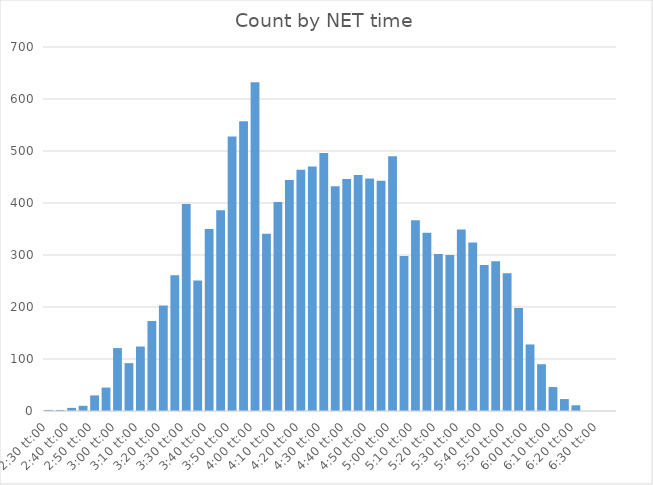
| Category | Count |
|---|---|
| 0.10416666666666667 | 2 |
| 0.1076388888888889 | 2 |
| 0.111111111111111 | 6 |
| 0.114583333333333 | 10 |
| 0.118055555555556 | 30 |
| 0.121527777777778 | 45 |
| 0.125 | 121 |
| 0.128472222222222 | 92 |
| 0.131944444444444 | 124 |
| 0.135416666666667 | 173 |
| 0.138888888888889 | 203 |
| 0.142361111111111 | 261 |
| 0.145833333333333 | 398 |
| 0.149305555555556 | 251 |
| 0.152777777777778 | 350 |
| 0.15625 | 386 |
| 0.159722222222222 | 528 |
| 0.163194444444444 | 557 |
| 0.166666666666667 | 632 |
| 0.170138888888889 | 341 |
| 0.173611111111111 | 402 |
| 0.177083333333333 | 444 |
| 0.180555555555556 | 464 |
| 0.184027777777778 | 470 |
| 0.1875 | 496 |
| 0.190972222222222 | 432 |
| 0.194444444444444 | 446 |
| 0.197916666666667 | 454 |
| 0.201388888888889 | 447 |
| 0.204861111111111 | 443 |
| 0.208333333333334 | 490 |
| 0.211805555555556 | 298 |
| 0.215277777777778 | 367 |
| 0.21875 | 343 |
| 0.222222222222223 | 302 |
| 0.225694444444445 | 300 |
| 0.229166666666667 | 349 |
| 0.232638888888889 | 324 |
| 0.236111111111112 | 281 |
| 0.239583333333334 | 288 |
| 0.243055555555556 | 265 |
| 0.246527777777778 | 198 |
| 0.25 | 128 |
| 0.253472222222223 | 90 |
| 0.256944444444445 | 46 |
| 0.260416666666667 | 23 |
| 0.263888888888889 | 11 |
| 0.267361111111112 | 0 |
| 0.270833333333334 | 0 |
| 0.274305555555556 | 0 |